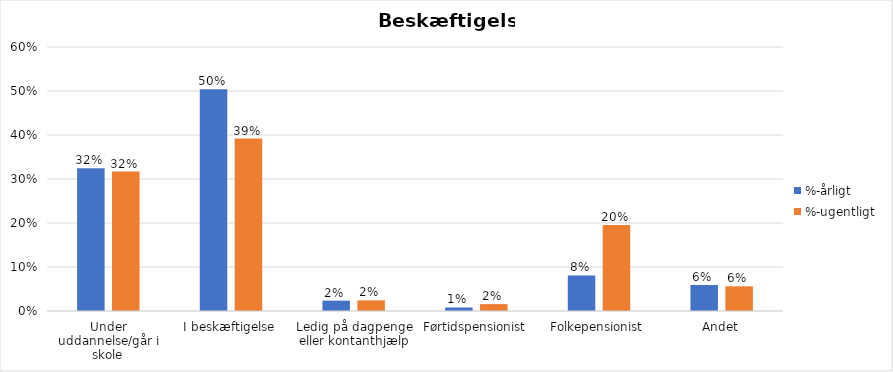
| Category | %-årligt | %-ugentligt |
|---|---|---|
| Under uddannelse/går i skole | 0.324 | 0.317 |
| I beskæftigelse | 0.504 | 0.392 |
| Ledig på dagpenge eller kontanthjælp | 0.024 | 0.024 |
| Førtidspensionist | 0.008 | 0.016 |
| Folkepensionist | 0.081 | 0.195 |
| Andet | 0.059 | 0.056 |